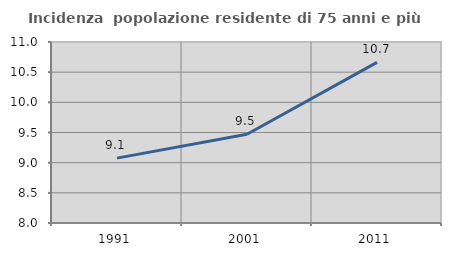
| Category | Incidenza  popolazione residente di 75 anni e più |
|---|---|
| 1991.0 | 9.075 |
| 2001.0 | 9.471 |
| 2011.0 | 10.663 |